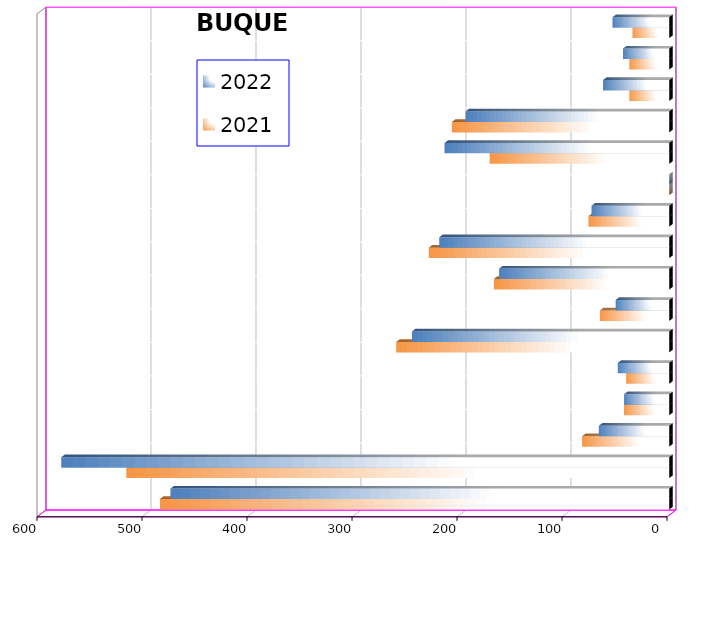
| Category | 2021 | 2022 |
|---|---|---|
| ICAVE | 485 | 475 |
| CICE | 517 | 579 |
| T. C. E. | 83 | 67 |
| CARGILL | 43 | 43 |
| TMV | 41 | 49 |
| SSA | 260 | 245 |
| SEPSA | 66 | 51 |
| VOPAK | 167 | 162 |
| CPV | 229 | 219 |
| EXCELLENCE | 77 | 74 |
| APASCO | 0 | 0 |
| SIPPB | 171 | 214 |
| PEMEX | 207 | 194 |
| PETRA | 38 | 63 |
| OPEVER | 38 | 44 |
| ESJ Renovable III | 35 | 54 |